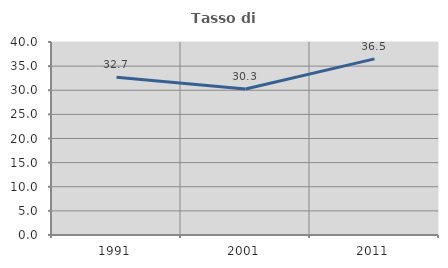
| Category | Tasso di occupazione   |
|---|---|
| 1991.0 | 32.713 |
| 2001.0 | 30.265 |
| 2011.0 | 36.501 |